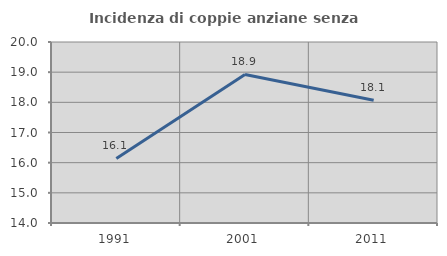
| Category | Incidenza di coppie anziane senza figli  |
|---|---|
| 1991.0 | 16.142 |
| 2001.0 | 18.925 |
| 2011.0 | 18.069 |